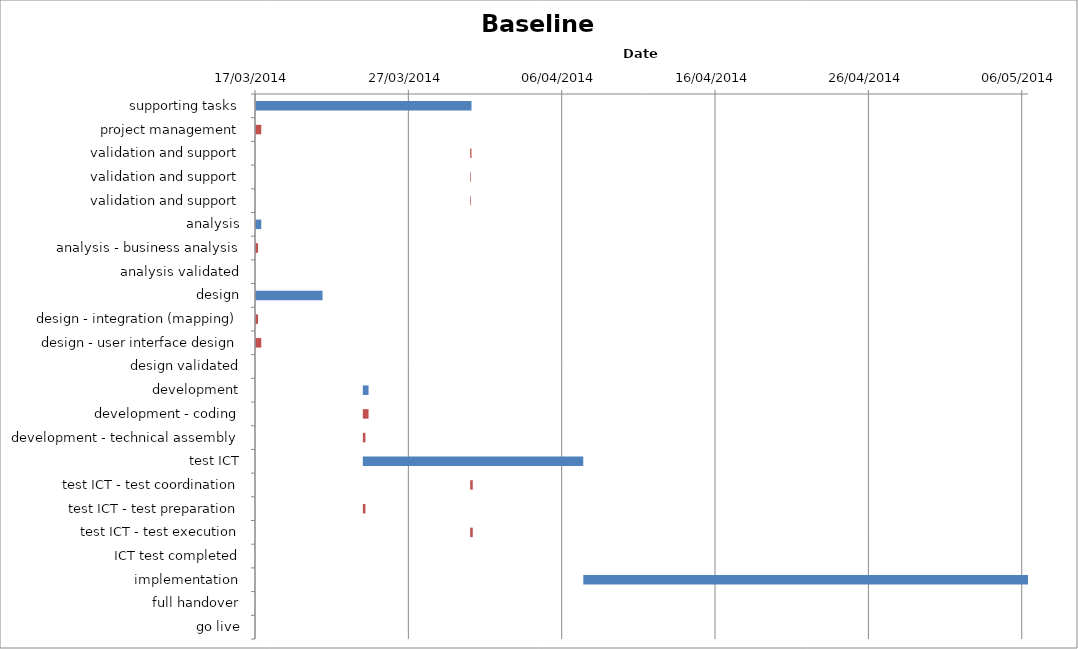
| Category | Baseline start | Actual duration |
|---|---|---|
| supporting tasks | 41715.333 | 14.083 |
| project management | 41715.333 | 0.375 |
| validation and support | 41729.333 | 0.083 |
| validation and support | 41729.333 | 0.042 |
| validation and support | 41729.333 | 0.042 |
| analysis | 41715.333 | 0.375 |
| analysis - business analysis | 41715.333 | 0.167 |
| analysis validated | 41715.708 | 0 |
| design | 41715.333 | 4.375 |
| design - integration (mapping) | 41715.333 | 0.167 |
| design - user interface design | 41715.333 | 0.375 |
| design validated | 41719.708 | 0 |
| development | 41722.333 | 0.375 |
| development - coding | 41722.333 | 0.375 |
| development - technical assembly | 41722.333 | 0.167 |
| test ICT | 41722.333 | 14.375 |
| test ICT - test coordination | 41729.333 | 0.167 |
| test ICT - test preparation | 41722.333 | 0.167 |
| test ICT - test execution | 41729.333 | 0.167 |
| ICT test completed | 41736.708 | 0 |
| implementation | 41736.708 | 29 |
| full handover | 41736.708 | 0 |
| go live | 41765.708 | 0 |